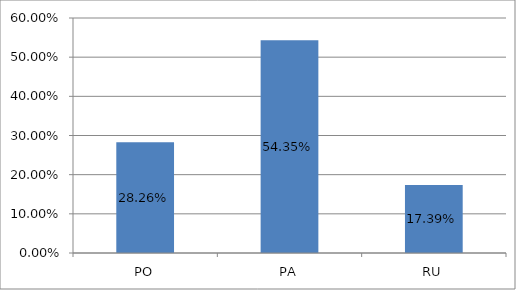
| Category | Series 0 |
|---|---|
| PO | 0.283 |
| PA | 0.543 |
| RU | 0.174 |